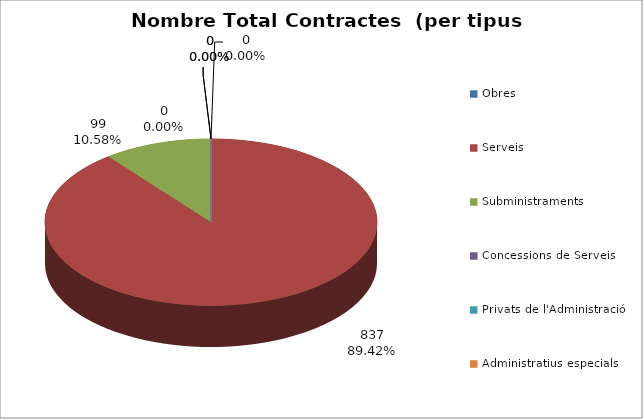
| Category | Nombre Total Contractes |
|---|---|
| Obres | 0 |
| Serveis | 837 |
| Subministraments | 99 |
| Concessions de Serveis | 0 |
| Privats de l'Administració | 0 |
| Administratius especials | 0 |